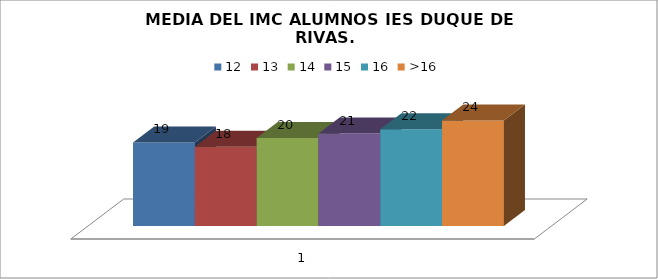
| Category | 12 | 13 | 14 | 15 | 16 | >16 |
|---|---|---|---|---|---|---|
| 0 | 19 | 18 | 20 | 21 | 22 | 24 |